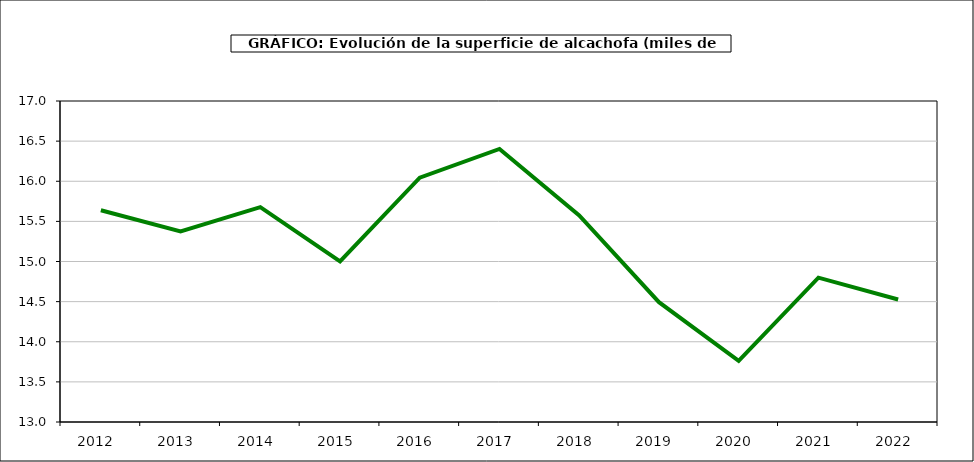
| Category | superficie |
|---|---|
| 2012.0 | 15.638 |
| 2013.0 | 15.376 |
| 2014.0 | 15.678 |
| 2015.0 | 15.002 |
| 2016.0 | 16.045 |
| 2017.0 | 16.403 |
| 2018.0 | 15.575 |
| 2019.0 | 14.493 |
| 2020.0 | 13.762 |
| 2021.0 | 14.799 |
| 2022.0 | 14.526 |